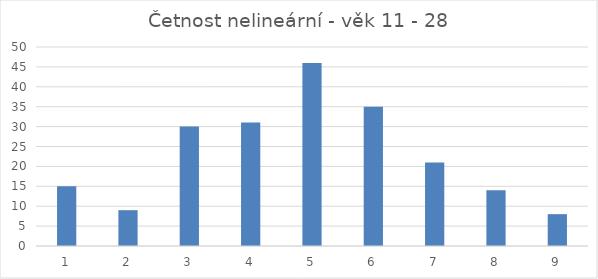
| Category | Četnost nelineární |
|---|---|
| 1.0 | 15 |
| 2.0 | 9 |
| 3.0 | 30 |
| 4.0 | 31 |
| 5.0 | 46 |
| 6.0 | 35 |
| 7.0 | 21 |
| 8.0 | 14 |
| 9.0 | 8 |